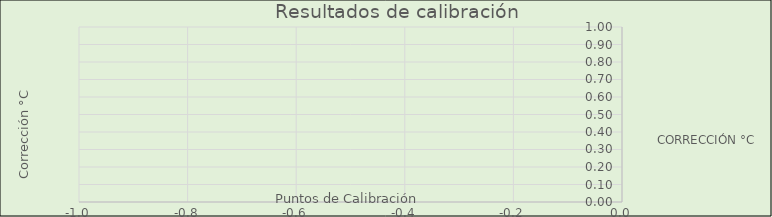
| Category | CORRECCIÓN °C |
|---|---|
| 0.0 | 0 |
| 0.0 | 0 |
| 0.0 | 0 |